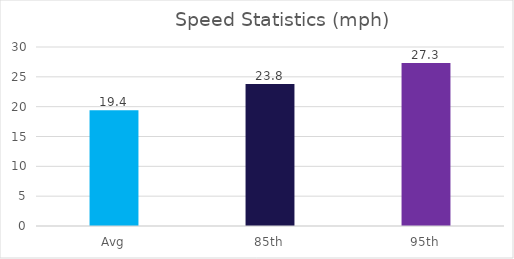
| Category | Series 0 |
|---|---|
| Avg | 19.4 |
| 85th | 23.8 |
| 95th | 27.3 |